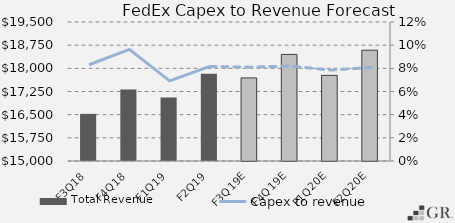
| Category | Total Revenue |
|---|---|
|  F3Q18  | 16526 |
|  F4Q18  | 17314.126 |
|  F1Q19  | 17052 |
|  F2Q19  | 17824 |
|  F3Q19E  | 17689.855 |
|  F4Q19E  | 18450.885 |
|  F1Q20E  | 17772.986 |
|  F2Q20E  | 18587.362 |